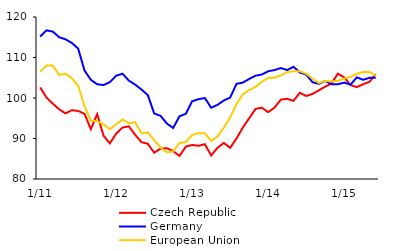
| Category | Czech Republic | Germany | European Union |
|---|---|---|---|
|  1/11 | 102.6 | 115.2 | 106.5 |
| 2 | 100.1 | 116.7 | 108 |
| 3 | 98.6 | 116.4 | 108 |
| 4 | 97.2 | 115 | 105.7 |
| 5 | 96.2 | 114.5 | 106 |
| 6 | 97 | 113.6 | 104.9 |
| 7 | 96.8 | 112.2 | 103 |
| 8 | 96.1 | 106.8 | 98 |
| 9 | 92.3 | 104.5 | 94.4 |
| 10 | 96 | 103.4 | 94.3 |
| 11 | 90.7 | 103.2 | 93.5 |
| 12 | 88.8 | 103.9 | 92.3 |
|  1/12 | 91.2 | 105.5 | 93.5 |
| 2 | 92.7 | 106 | 94.7 |
| 3 | 93 | 104.3 | 93.8 |
| 4 | 90.9 | 103.3 | 94 |
| 5 | 89.1 | 102.1 | 91.3 |
| 6 | 88.7 | 100.7 | 91.5 |
| 7 | 86.5 | 96.2 | 89.6 |
| 8 | 87.5 | 95.6 | 87.8 |
| 9 | 87.6 | 93.7 | 86.6 |
| 10 | 86.9 | 92.6 | 86.8 |
| 11 | 85.7 | 95.5 | 88.9 |
| 12 | 88 | 96.1 | 89.1 |
|  1/13 | 88.4 | 99.2 | 90.9 |
| 2 | 88.2 | 99.7 | 91.3 |
| 3 | 88.6 | 100 | 91.3 |
| 4 | 85.8 | 97.6 | 89.4 |
| 5 | 87.7 | 98.3 | 90.5 |
| 6 | 88.9 | 99.4 | 92.7 |
| 7 | 87.7 | 100.1 | 95.2 |
| 8 | 90 | 103.5 | 98.5 |
| 9 | 92.7 | 103.8 | 100.9 |
| 10 | 95 | 104.7 | 102 |
| 11 | 97.3 | 105.5 | 102.7 |
| 12 | 97.6 | 105.8 | 104 |
|  1/14 | 96.5 | 106.6 | 105 |
| 2 | 97.6 | 106.9 | 105 |
| 3 | 99.6 | 107.4 | 105.6 |
| 4 | 99.8 | 106.9 | 106.4 |
| 5 | 99.3 | 107.7 | 106.6 |
| 6 | 101.3 | 106.3 | 106.6 |
| 7 | 100.5 | 105.8 | 106 |
| 8 | 101 | 103.9 | 104.8 |
| 9 | 101.9 | 103.5 | 103.7 |
| 10 | 102.8 | 104.2 | 104.2 |
| 11 | 103.6 | 103.4 | 104.1 |
| 12 | 106 | 103.4 | 104.2 |
|  1/15 | 105.1 | 103.8 | 104.8 |
| 2 | 103.2 | 103.3 | 105.2 |
| 3 | 102.7 | 105.1 | 106 |
| 4 | 103.4 | 104.5 | 106.4 |
| 5 | 104 | 105 | 106.4 |
| 6 | 105.9 | 105 | 105.5 |